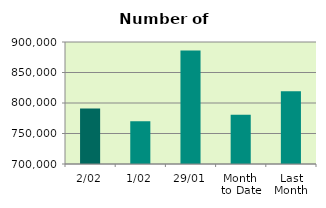
| Category | Series 0 |
|---|---|
| 2/02 | 791150 |
| 1/02 | 769916 |
| 29/01 | 885962 |
| Month 
to Date | 780533 |
| Last
Month | 819236.4 |